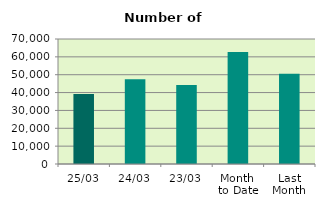
| Category | Series 0 |
|---|---|
| 25/03 | 39254 |
| 24/03 | 47490 |
| 23/03 | 44218 |
| Month 
to Date | 62782.211 |
| Last
Month | 50484.7 |